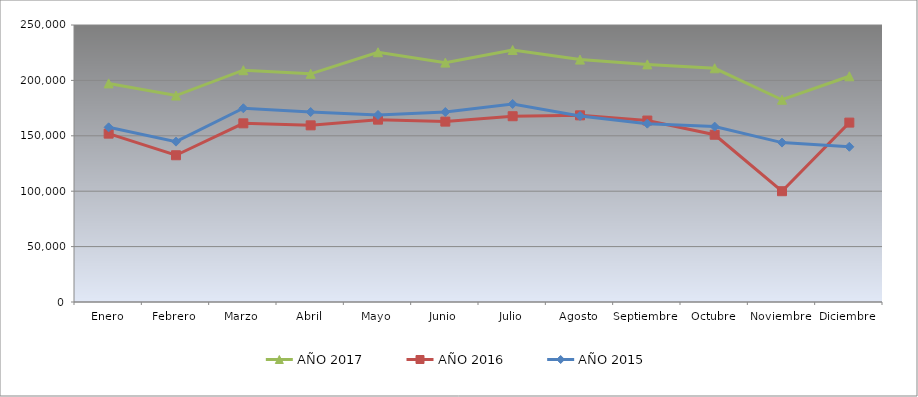
| Category | AÑO 2017 | AÑO 2016 | AÑO 2015 |
|---|---|---|---|
| Enero | 197292.297 | 151951.055 | 157652.807 |
| Febrero | 186326.557 | 132438.758 | 144726.427 |
| Marzo | 209193.029 | 161247.958 | 174849.351 |
| Abril | 205931.412 | 159433.881 | 171461.474 |
| Mayo | 225380.703 | 164578.635 | 168781.484 |
| Junio | 216045.488 | 162799.126 | 171437.952 |
| Julio | 227448.486 | 167670.744 | 178715.438 |
| Agosto | 218769.427 | 168470.845 | 167879.312 |
| Septiembre | 214435.574 | 163774.223 | 160955.008 |
| Octubre | 210943.046 | 150958.653 | 158292.599 |
| Noviembre | 182541.297 | 99984.704 | 143868.263 |
| Diciembre | 203712.224 | 161913.745 | 140101.731 |